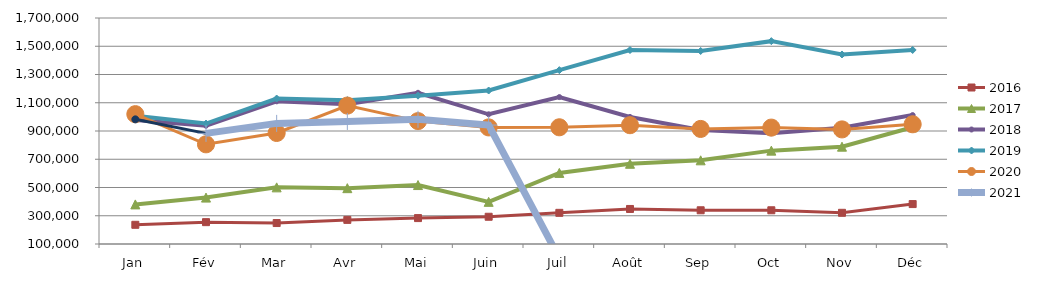
| Category | 2015 | 2016 | 2017 | 2018 | 2019 | 2020 | 2021 |
|---|---|---|---|---|---|---|---|
| Jan |  | 235903.093 | 380222.25 | 978468.279 | 1007982.373 | 1019103.465 | 982555.093 |
| Fév |  | 254650.591 | 428502.997 | 937137.209 | 952616.766 | 805837.355 | 883272.289 |
| Mar |  | 248425.98 | 500955.694 | 1110199.711 | 1129815.679 | 886115.696 | 953969.676 |
| Avr |  | 270687.752 | 495255.535 | 1090229.308 | 1118398.221 | 1079723.465 | 967473.972 |
| Mai |  | 283507.34 | 517298.538 | 1170512.154 | 1150217.455 | 970040.088 | 982779.252 |
| Juin |  | 292820.053 | 398427.247 | 1018295.812 | 1186623.687 | 925406.896 | 941931.836 |
| Juil |  | 320615.91 | 603419.402 | 1140133.118 | 1330812.699 | 926286.755 | 0 |
| Août |  | 348014.816 | 667973.667 | 999343.146 | 1473280.035 | 941195.84 | 0 |
| Sep |  | 338807.949 | 692403.495 | 907808.882 | 1466448.158 | 914678.196 | 0 |
| Oct |  | 338820.212 | 760969.174 | 883825.979 | 1536100.268 | 923984.732 | 0 |
| Nov |  | 320858.147 | 789037.665 | 922678.039 | 1441770.199 | 911296.416 | 0 |
| Déc |  | 382727.181 | 926372.399 | 1012620.724 | 1473565.92 | 947568.113 | 0 |